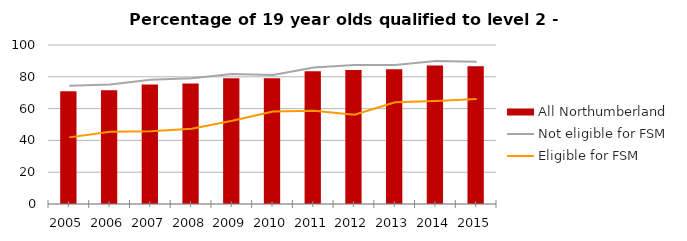
| Category | All Northumberland |
|---|---|
| 2005.0 | 70.9 |
| 2006.0 | 71.6 |
| 2007.0 | 75.1 |
| 2008.0 | 75.8 |
| 2009.0 | 79.1 |
| 2010.0 | 79.1 |
| 2011.0 | 83.5 |
| 2012.0 | 84.3 |
| 2013.0 | 84.8 |
| 2014.0 | 87.1 |
| 2015.0 | 86.7 |